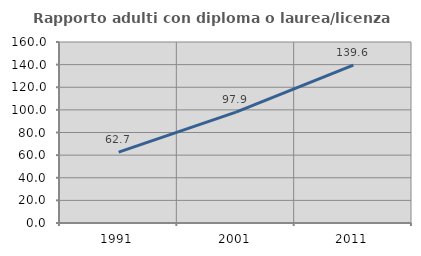
| Category | Rapporto adulti con diploma o laurea/licenza media  |
|---|---|
| 1991.0 | 62.72 |
| 2001.0 | 97.943 |
| 2011.0 | 139.635 |